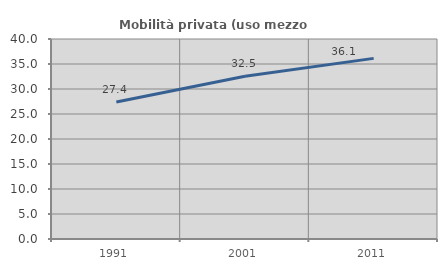
| Category | Mobilità privata (uso mezzo privato) |
|---|---|
| 1991.0 | 27.417 |
| 2001.0 | 32.532 |
| 2011.0 | 36.124 |